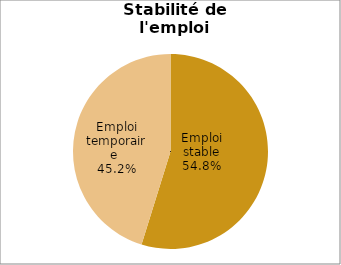
| Category | Promotion 2007 |
|---|---|
| Emploi stable | 0.548 |
| Emploi temporaire  | 0.452 |